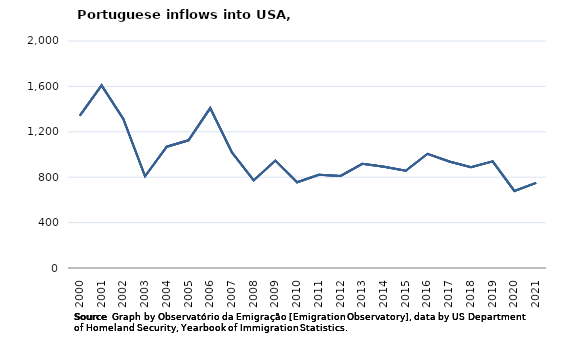
| Category | Entradas de portugueses |
|---|---|
| 2000.0 | 1343 |
| 2001.0 | 1609 |
| 2002.0 | 1313 |
| 2003.0 | 808 |
| 2004.0 | 1069 |
| 2005.0 | 1125 |
| 2006.0 | 1409 |
| 2007.0 | 1019 |
| 2008.0 | 772 |
| 2009.0 | 946 |
| 2010.0 | 755 |
| 2011.0 | 821 |
| 2012.0 | 811 |
| 2013.0 | 918 |
| 2014.0 | 892 |
| 2015.0 | 857 |
| 2016.0 | 1006 |
| 2017.0 | 939 |
| 2018.0 | 889 |
| 2019.0 | 940 |
| 2020.0 | 679 |
| 2021.0 | 750 |